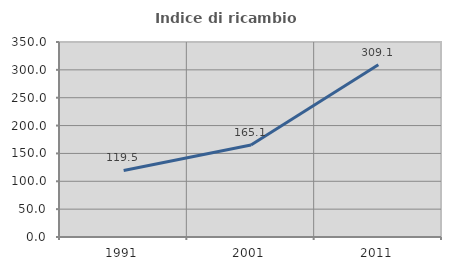
| Category | Indice di ricambio occupazionale  |
|---|---|
| 1991.0 | 119.509 |
| 2001.0 | 165.055 |
| 2011.0 | 309.076 |